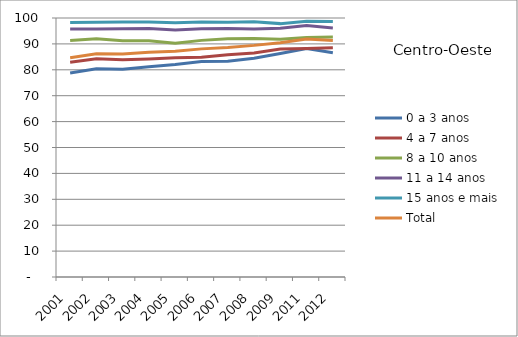
| Category | 0 a 3 anos | 4 a 7 anos | 8 a 10 anos | 11 a 14 anos | 15 anos e mais | Total |
|---|---|---|---|---|---|---|
| 2001.0 | 78.77 | 82.93 | 91.27 | 95.73 | 98.28 | 84.68 |
| 2002.0 | 80.38 | 84.29 | 91.97 | 95.77 | 98.32 | 86.19 |
| 2003.0 | 80.23 | 83.89 | 91.2 | 95.87 | 98.48 | 86.1 |
| 2004.0 | 81.21 | 84.2 | 91.22 | 95.98 | 98.42 | 86.77 |
| 2005.0 | 82.08 | 84.68 | 90.22 | 95.41 | 98.16 | 87.16 |
| 2006.0 | 83.21 | 84.82 | 91.36 | 95.88 | 98.49 | 88.08 |
| 2007.0 | 83.34 | 85.8 | 91.96 | 95.97 | 98.39 | 88.61 |
| 2008.0 | 84.5 | 86.53 | 92.04 | 95.8 | 98.56 | 89.43 |
| 2009.0 | 86.33 | 88.01 | 91.83 | 96.06 | 97.83 | 90.48 |
| 2011.0 | 88.25 | 88.18 | 92.5 | 97.13 | 98.74 | 91.92 |
| 2012.0 | 86.56 | 88.47 | 92.66 | 96.18 | 98.67 | 91.32 |